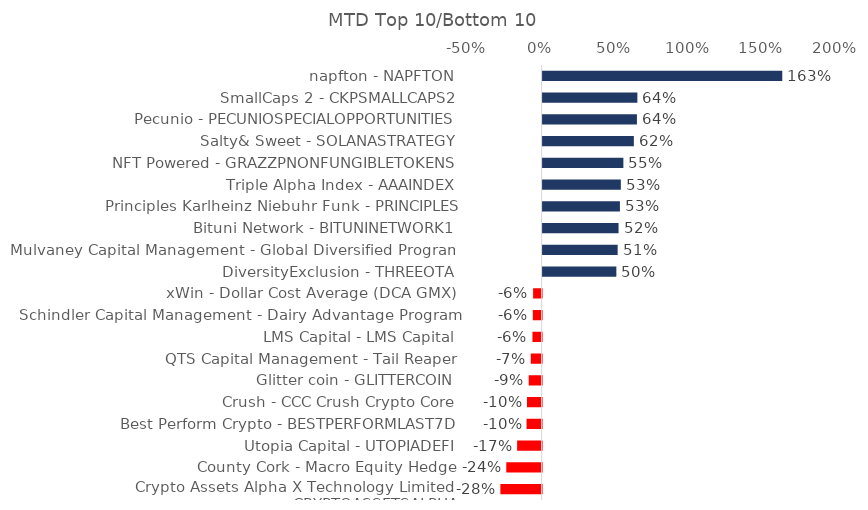
| Category | Series 0 |
|---|---|
| napfton - NAPFTON | 1.628 |
| SmallCaps 2 - CKPSMALLCAPS2 | 0.644 |
| Pecunio - PECUNIOSPECIALOPPORTUNITIES | 0.641 |
| Salty& Sweet - SOLANASTRATEGY | 0.62 |
| NFT Powered - GRAZZPNONFUNGIBLETOKENS | 0.549 |
| Triple Alpha Index - AAAINDEX | 0.532 |
| Principles Karlheinz Niebuhr Funk - PRINCIPLES | 0.525 |
| Bituni Network - BITUNINETWORK1 | 0.516 |
| Mulvaney Capital Management - Global Diversified Program | 0.51 |
| DiversityExclusion - THREEOTA | 0.501 |
| xWin - Dollar Cost Average (DCA GMX) | -0.058 |
| Schindler Capital Management - Dairy Advantage Program | -0.06 |
| LMS Capital - LMS Capital | -0.062 |
| QTS Capital Management - Tail Reaper | -0.074 |
| Glitter coin - GLITTERCOIN | -0.088 |
| Crush - CCC Crush Crypto Core | -0.099 |
| Best Perform Crypto - BESTPERFORMLAST7D | -0.102 |
| Utopia Capital - UTOPIADEFI | -0.166 |
| County Cork - Macro Equity Hedge | -0.24 |
| Crypto Assets Alpha X Technology Limited - CRYPTOASSETSALPHA | -0.28 |